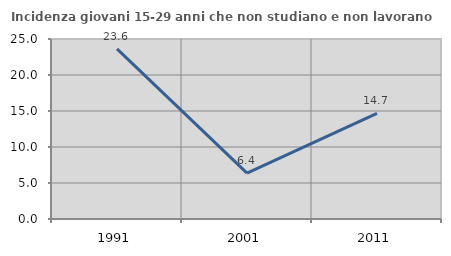
| Category | Incidenza giovani 15-29 anni che non studiano e non lavorano  |
|---|---|
| 1991.0 | 23.62 |
| 2001.0 | 6.364 |
| 2011.0 | 14.679 |